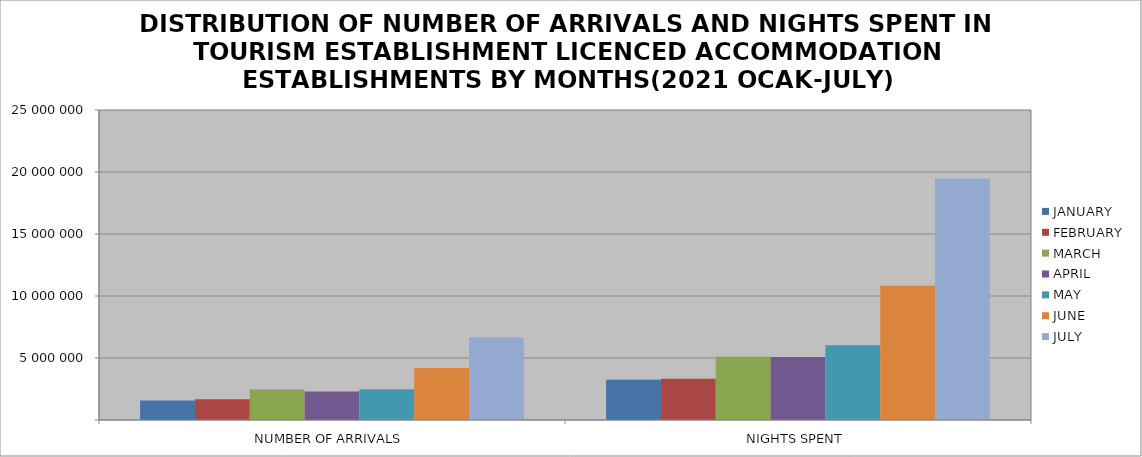
| Category | JANUARY | FEBRUARY | MARCH | APRIL | MAY | JUNE | JULY |
|---|---|---|---|---|---|---|---|
| NUMBER OF ARRIVALS | 1571594 | 1670164 | 2462715 | 2305703 | 2480312 | 4203299 | 6647723 |
| NIGHTS SPENT | 3239980 | 3333484 | 5094921 | 5081446 | 6019981 | 10819754 | 19475865 |